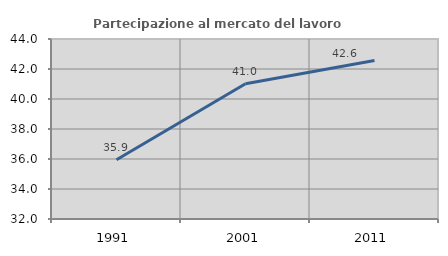
| Category | Partecipazione al mercato del lavoro  femminile |
|---|---|
| 1991.0 | 35.948 |
| 2001.0 | 41.022 |
| 2011.0 | 42.562 |